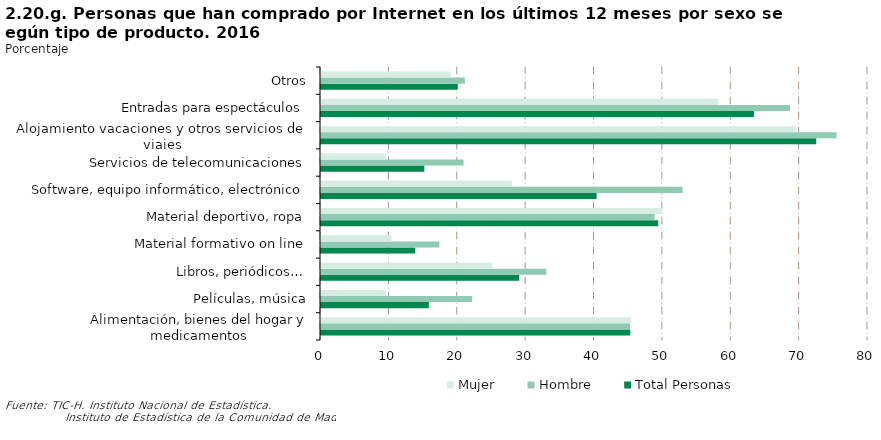
| Category | Total Personas | Hombre | Mujer |
|---|---|---|---|
| Alimentación, bienes del hogar y medicamentos | 45.238 | 45.173 | 45.302 |
| Películas, música | 15.767 | 22.113 | 9.499 |
| Libros, periódicos… | 28.992 | 32.976 | 25.057 |
| Material formativo on line | 13.782 | 17.316 | 10.292 |
| Material deportivo, ropa | 49.324 | 48.773 | 49.868 |
| Software, equipo informático, electrónico | 40.31 | 52.876 | 27.897 |
| Servicios de telecomunicaciones | 15.113 | 20.852 | 9.443 |
| Alojamiento vacaciones y otros servicios de viajes | 72.434 | 75.409 | 69.495 |
| Entradas para espectáculos | 63.31 | 68.592 | 58.093 |
| Otros | 19.989 | 21.049 | 18.943 |